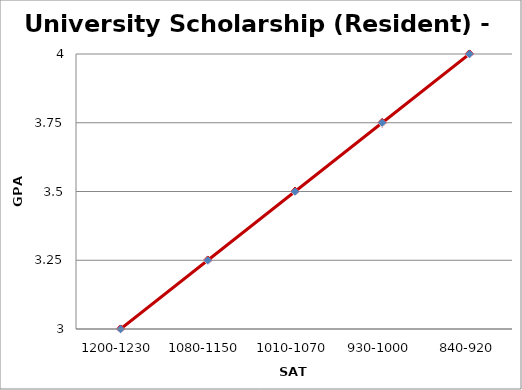
| Category | Dean's Award - $2750 |
|---|---|
| 1200-1230 | 3 |
| 1080-1150 | 3.25 |
| 1010-1070 | 3.5 |
| 930-1000 | 3.75 |
| 840-920 | 4 |